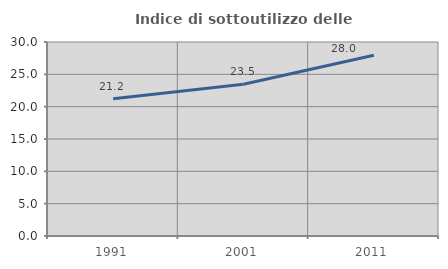
| Category | Indice di sottoutilizzo delle abitazioni  |
|---|---|
| 1991.0 | 21.212 |
| 2001.0 | 23.468 |
| 2011.0 | 27.96 |